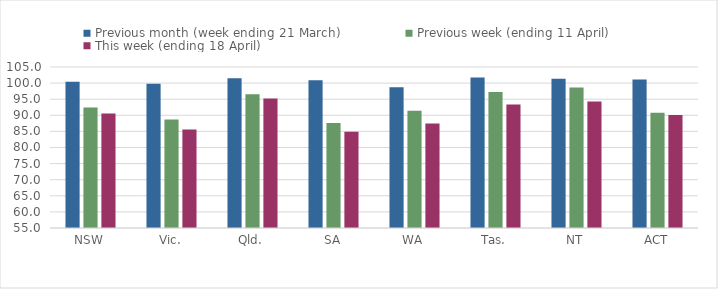
| Category | Previous month (week ending 21 March) | Previous week (ending 11 April) | This week (ending 18 April) |
|---|---|---|---|
| NSW | 100.451 | 92.394 | 90.536 |
| Vic. | 99.772 | 88.664 | 85.623 |
| Qld. | 101.469 | 96.538 | 95.205 |
| SA | 100.882 | 87.624 | 84.865 |
| WA | 98.715 | 91.415 | 87.44 |
| Tas. | 101.725 | 97.197 | 93.35 |
| NT | 101.337 | 98.663 | 94.318 |
| ACT | 101.149 | 90.805 | 90.103 |